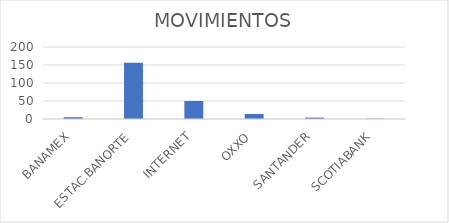
| Category | MOVIMIENTOS |
|---|---|
| BANAMEX | 5 |
| ESTAC.BANORTE | 156 |
| INTERNET | 50 |
| OXXO | 14 |
| SANTANDER | 4 |
| SCOTIABANK | 1 |